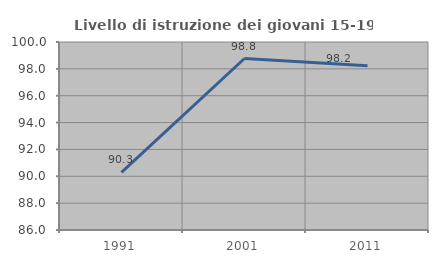
| Category | Livello di istruzione dei giovani 15-19 anni |
|---|---|
| 1991.0 | 90.295 |
| 2001.0 | 98.77 |
| 2011.0 | 98.225 |